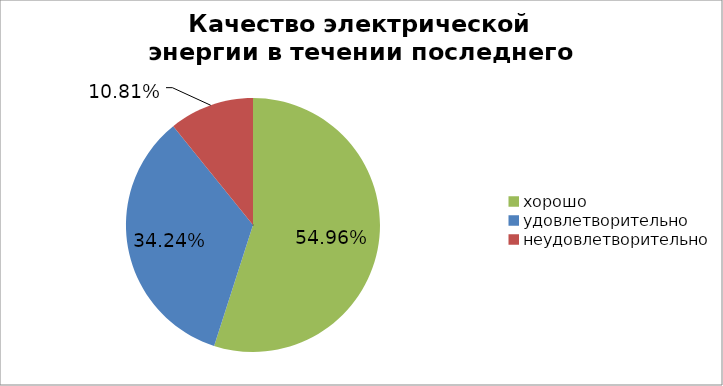
| Category | Series 1 |
|---|---|
| хорошо | 0.555 |
| удовлетворительно | 0.345 |
| неудовлетворительно | 0.109 |